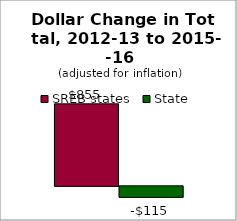
| Category | SREB states | State |
|---|---|---|
| 0 | 855.408 | -114.72 |